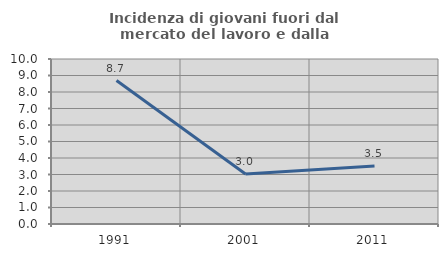
| Category | Incidenza di giovani fuori dal mercato del lavoro e dalla formazione  |
|---|---|
| 1991.0 | 8.696 |
| 2001.0 | 3.03 |
| 2011.0 | 3.518 |